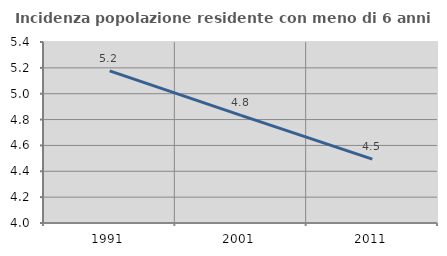
| Category | Incidenza popolazione residente con meno di 6 anni |
|---|---|
| 1991.0 | 5.177 |
| 2001.0 | 4.832 |
| 2011.0 | 4.494 |